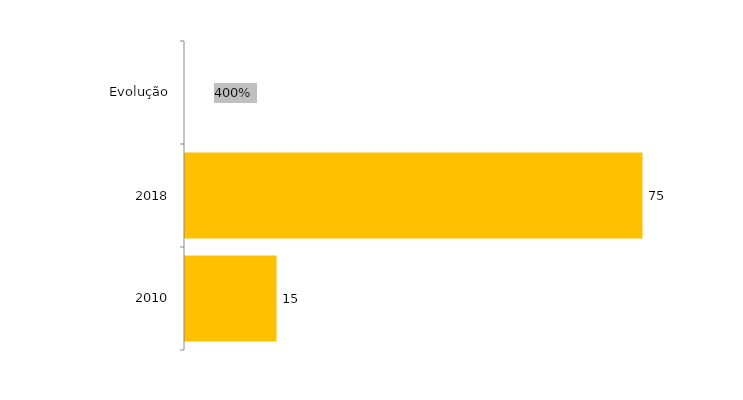
| Category | Evolução Matriculados |
|---|---|
| 2010 | 15 |
| 2018 | 75 |
| Evolução | 4 |